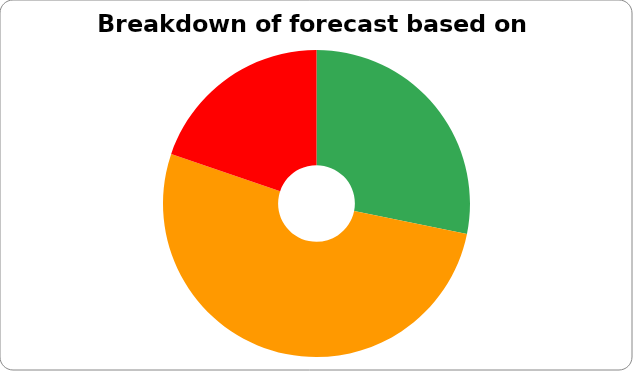
| Category | Series 0 |
|---|---|
| 0 | 81200 |
| 1 | 150000 |
| 2 | 57000 |